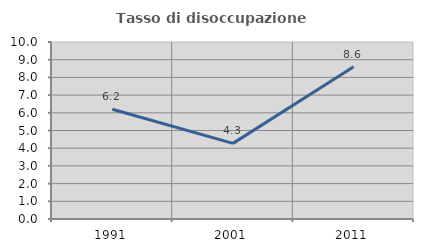
| Category | Tasso di disoccupazione giovanile  |
|---|---|
| 1991.0 | 6.197 |
| 2001.0 | 4.274 |
| 2011.0 | 8.597 |